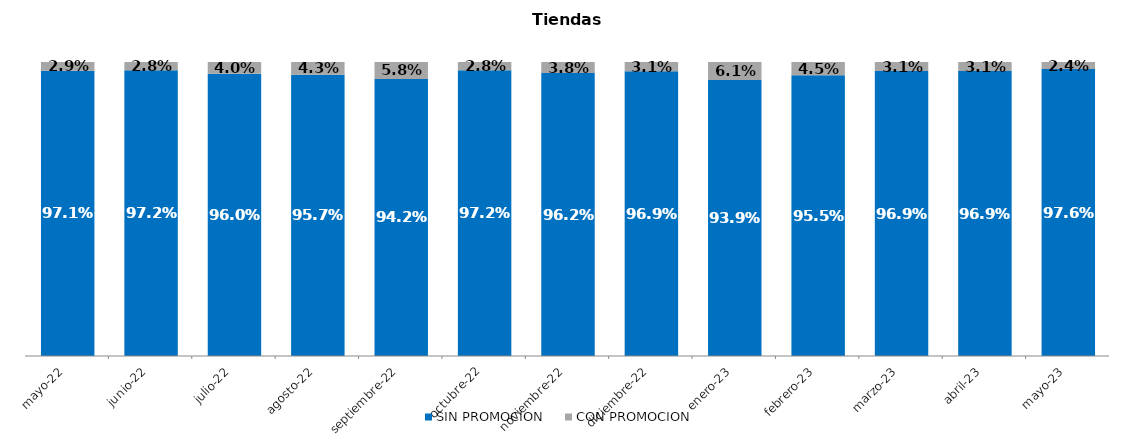
| Category | SIN PROMOCION   | CON PROMOCION   |
|---|---|---|
| 2022-05-01 | 0.971 | 0.029 |
| 2022-06-01 | 0.972 | 0.028 |
| 2022-07-01 | 0.96 | 0.04 |
| 2022-08-01 | 0.957 | 0.043 |
| 2022-09-01 | 0.942 | 0.058 |
| 2022-10-01 | 0.972 | 0.028 |
| 2022-11-01 | 0.962 | 0.038 |
| 2022-12-01 | 0.969 | 0.031 |
| 2023-01-01 | 0.939 | 0.061 |
| 2023-02-01 | 0.955 | 0.045 |
| 2023-03-01 | 0.969 | 0.031 |
| 2023-04-01 | 0.969 | 0.031 |
| 2023-05-01 | 0.976 | 0.024 |